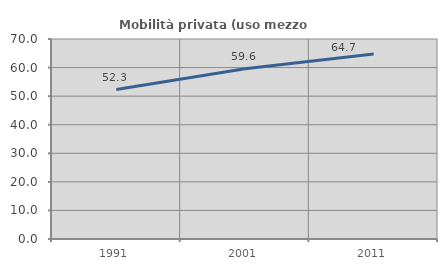
| Category | Mobilità privata (uso mezzo privato) |
|---|---|
| 1991.0 | 52.313 |
| 2001.0 | 59.552 |
| 2011.0 | 64.713 |